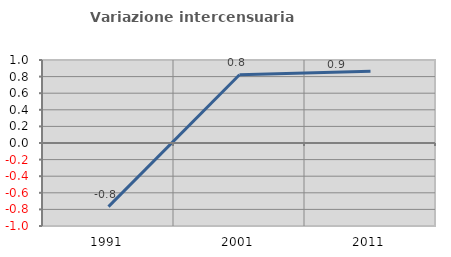
| Category | Variazione intercensuaria annua |
|---|---|
| 1991.0 | -0.766 |
| 2001.0 | 0.823 |
| 2011.0 | 0.864 |